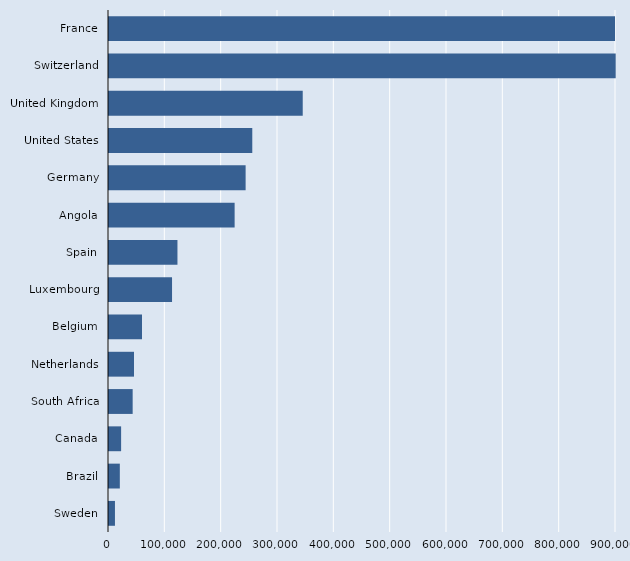
| Category | Series 2 |
|---|---|
| France | 1133290 |
| Switzerland | 899460 |
| United Kingdom | 343900 |
| United States | 254350 |
| Germany | 242520 |
| Angola | 223010 |
| Spain | 121520 |
| Luxembourg | 111910 |
| Belgium | 58580 |
| Netherlands | 44430 |
| South Africa | 42000 |
| Canada | 21510 |
| Brazil | 19220 |
| Sweden | 10570 |